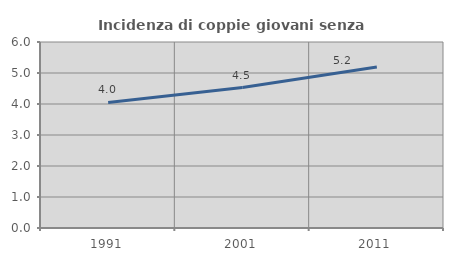
| Category | Incidenza di coppie giovani senza figli |
|---|---|
| 1991.0 | 4.049 |
| 2001.0 | 4.531 |
| 2011.0 | 5.19 |